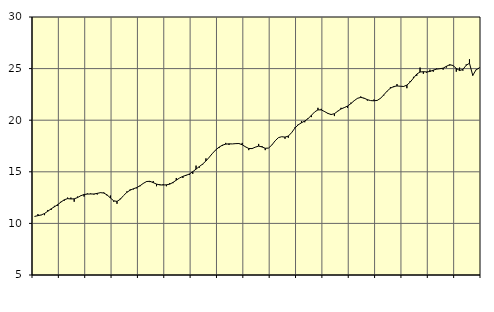
| Category | Piggar | Finansiell verksamhet, företagstjänster, SNI 64-82 |
|---|---|---|
| nan | 10.7 | 10.68 |
| 87.0 | 10.9 | 10.75 |
| 87.0 | 10.8 | 10.82 |
| 87.0 | 10.8 | 10.96 |
| nan | 11.3 | 11.18 |
| 88.0 | 11.3 | 11.41 |
| 88.0 | 11.7 | 11.61 |
| 88.0 | 11.7 | 11.82 |
| nan | 12.1 | 12.07 |
| 89.0 | 12.2 | 12.29 |
| 89.0 | 12.5 | 12.4 |
| 89.0 | 12.5 | 12.37 |
| nan | 12.1 | 12.38 |
| 90.0 | 12.6 | 12.5 |
| 90.0 | 12.7 | 12.68 |
| 90.0 | 12.6 | 12.8 |
| nan | 12.9 | 12.84 |
| 91.0 | 12.9 | 12.85 |
| 91.0 | 12.8 | 12.85 |
| 91.0 | 12.8 | 12.91 |
| nan | 13 | 12.98 |
| 92.0 | 13 | 12.94 |
| 92.0 | 12.7 | 12.76 |
| 92.0 | 12.7 | 12.46 |
| nan | 12.1 | 12.19 |
| 93.0 | 11.9 | 12.13 |
| 93.0 | 12.4 | 12.34 |
| 93.0 | 12.7 | 12.7 |
| nan | 13.1 | 13.01 |
| 94.0 | 13.3 | 13.22 |
| 94.0 | 13.3 | 13.36 |
| 94.0 | 13.4 | 13.47 |
| nan | 13.6 | 13.65 |
| 95.0 | 13.9 | 13.88 |
| 95.0 | 14.1 | 14.06 |
| 95.0 | 14 | 14.08 |
| nan | 14.1 | 13.95 |
| 96.0 | 13.6 | 13.81 |
| 96.0 | 13.8 | 13.73 |
| 96.0 | 13.8 | 13.72 |
| nan | 13.6 | 13.74 |
| 97.0 | 13.9 | 13.8 |
| 97.0 | 13.9 | 13.97 |
| 97.0 | 14.4 | 14.19 |
| nan | 14.4 | 14.4 |
| 98.0 | 14.4 | 14.56 |
| 98.0 | 14.7 | 14.66 |
| 98.0 | 14.7 | 14.79 |
| nan | 14.8 | 15.01 |
| 99.0 | 15.6 | 15.26 |
| 99.0 | 15.4 | 15.51 |
| 99.0 | 15.7 | 15.75 |
| nan | 16.3 | 16.05 |
| 0.0 | 16.4 | 16.41 |
| 0.0 | 16.8 | 16.79 |
| 0.0 | 17.1 | 17.13 |
| nan | 17.3 | 17.39 |
| 1.0 | 17.5 | 17.58 |
| 1.0 | 17.8 | 17.68 |
| 1.0 | 17.6 | 17.71 |
| nan | 17.7 | 17.7 |
| 2.0 | 17.7 | 17.73 |
| 2.0 | 17.7 | 17.74 |
| 2.0 | 17.8 | 17.62 |
| nan | 17.4 | 17.42 |
| 3.0 | 17.1 | 17.26 |
| 3.0 | 17.3 | 17.25 |
| 3.0 | 17.4 | 17.39 |
| nan | 17.7 | 17.49 |
| 4.0 | 17.5 | 17.41 |
| 4.0 | 17.1 | 17.28 |
| 4.0 | 17.3 | 17.3 |
| nan | 17.6 | 17.59 |
| 5.0 | 18 | 18 |
| 5.0 | 18.3 | 18.31 |
| 5.0 | 18.4 | 18.4 |
| nan | 18.2 | 18.36 |
| 6.0 | 18.3 | 18.46 |
| 6.0 | 18.8 | 18.79 |
| 6.0 | 19.3 | 19.23 |
| nan | 19.6 | 19.55 |
| 7.0 | 19.9 | 19.75 |
| 7.0 | 19.8 | 19.92 |
| 7.0 | 20.2 | 20.15 |
| nan | 20.3 | 20.47 |
| 8.0 | 20.8 | 20.8 |
| 8.0 | 21.2 | 21 |
| 8.0 | 21.1 | 21 |
| nan | 20.8 | 20.84 |
| 9.0 | 20.7 | 20.66 |
| 9.0 | 20.6 | 20.55 |
| 9.0 | 20.4 | 20.63 |
| nan | 20.9 | 20.87 |
| 10.0 | 21.2 | 21.09 |
| 10.0 | 21.2 | 21.22 |
| 10.0 | 21.2 | 21.37 |
| nan | 21.7 | 21.61 |
| 11.0 | 21.9 | 21.89 |
| 11.0 | 22.1 | 22.12 |
| 11.0 | 22.3 | 22.21 |
| nan | 22.1 | 22.14 |
| 12.0 | 21.9 | 21.99 |
| 12.0 | 21.9 | 21.9 |
| 12.0 | 22 | 21.88 |
| nan | 21.9 | 21.92 |
| 13.0 | 22.1 | 22.12 |
| 13.0 | 22.4 | 22.46 |
| 13.0 | 22.8 | 22.82 |
| nan | 23.2 | 23.1 |
| 14.0 | 23.2 | 23.26 |
| 14.0 | 23.5 | 23.32 |
| 14.0 | 23.3 | 23.29 |
| nan | 23.3 | 23.27 |
| 15.0 | 23.1 | 23.4 |
| 15.0 | 23.8 | 23.69 |
| 15.0 | 24.2 | 24.08 |
| nan | 24.3 | 24.47 |
| 16.0 | 25.1 | 24.67 |
| 16.0 | 24.5 | 24.7 |
| 16.0 | 24.6 | 24.68 |
| nan | 24.9 | 24.72 |
| 17.0 | 24.7 | 24.85 |
| 17.0 | 25 | 24.95 |
| 17.0 | 25 | 24.99 |
| nan | 24.9 | 25.04 |
| 18.0 | 25.1 | 25.22 |
| 18.0 | 25.3 | 25.38 |
| 18.0 | 25.3 | 25.3 |
| nan | 24.7 | 25.02 |
| 19.0 | 25.1 | 24.81 |
| 19.0 | 24.8 | 24.92 |
| 19.0 | 25.4 | 25.32 |
| nan | 25.9 | 25.52 |
| 20.0 | 24.3 | 24.34 |
| 20.0 | 24.9 | 24.88 |
| 20.0 | 25.1 | 25.06 |